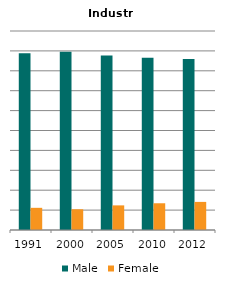
| Category | Male | Female |
|---|---|---|
| 1991.0 | 0.889 | 0.111 |
| 2000.0 | 0.896 | 0.104 |
| 2005.0 | 0.876 | 0.124 |
| 2010.0 | 0.866 | 0.134 |
| 2012.0 | 0.859 | 0.141 |